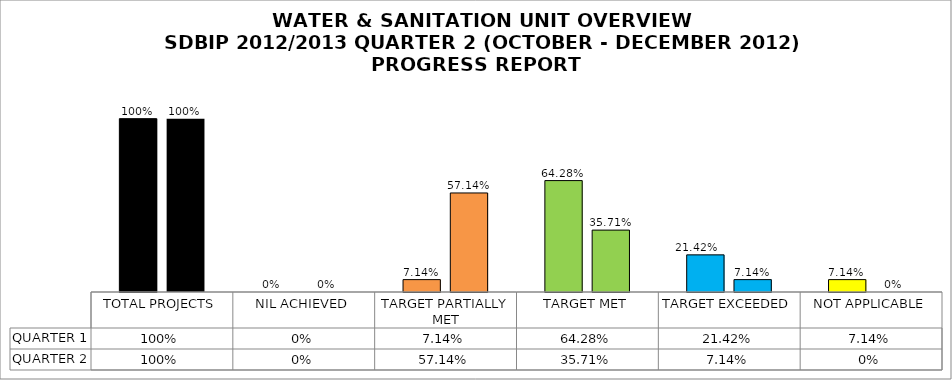
| Category | QUARTER 1 | QUARTER 2 |
|---|---|---|
| TOTAL PROJECTS | 1 | 1 |
| NIL ACHIEVED | 0 | 0 |
| TARGET PARTIALLY MET | 0.071 | 0.571 |
| TARGET MET | 0.643 | 0.357 |
| TARGET EXCEEDED | 0.214 | 0.071 |
| NOT APPLICABLE | 0.071 | 0 |